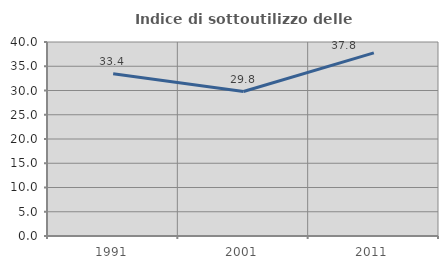
| Category | Indice di sottoutilizzo delle abitazioni  |
|---|---|
| 1991.0 | 33.431 |
| 2001.0 | 29.781 |
| 2011.0 | 37.766 |